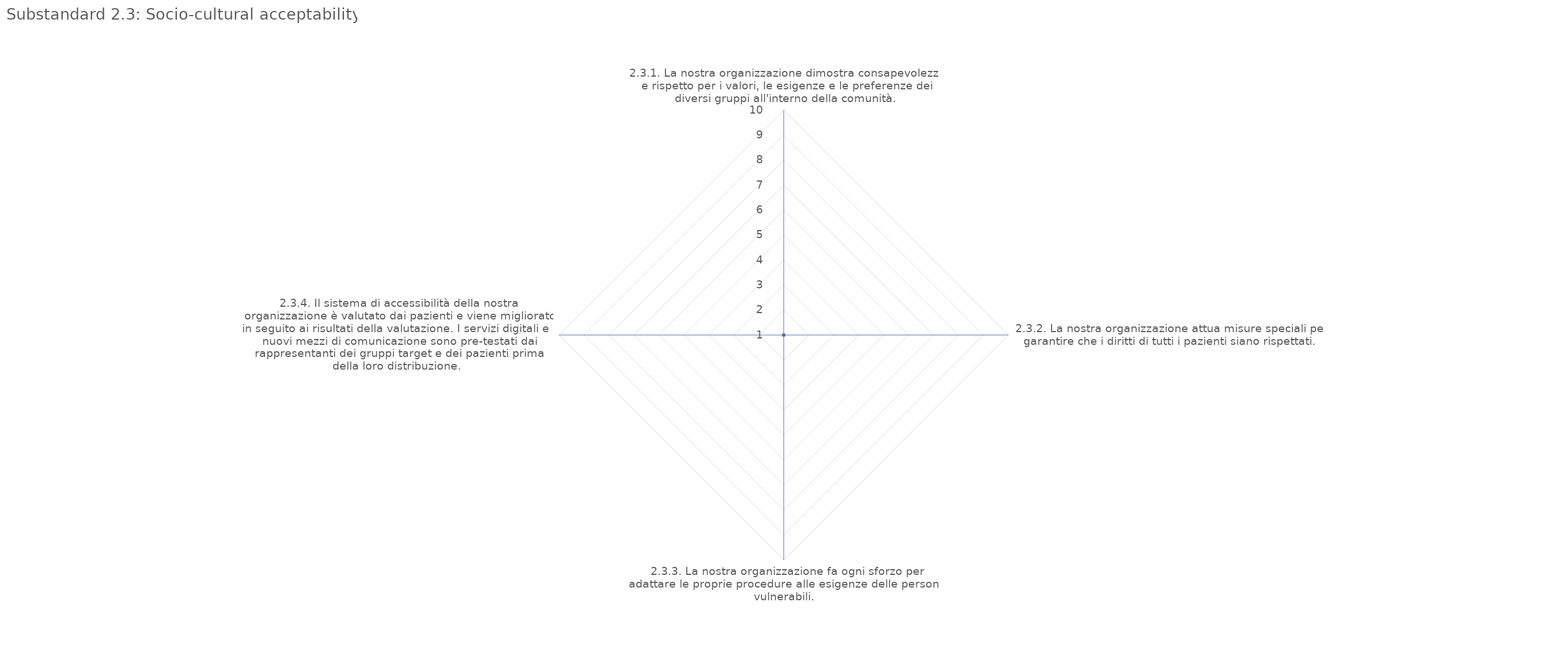
| Category | value |
|---|---|
| 2.3.1. La nostra organizzazione dimostra consapevolezza e rispetto per i valori, le esigenze e le preferenze dei diversi gruppi all'interno della comunità. | 1 |
| 2.3.2. La nostra organizzazione attua misure speciali per garantire che i diritti di tutti i pazienti siano rispettati. | 1 |
| 2.3.3. La nostra organizzazione fa ogni sforzo per adattare le proprie procedure alle esigenze delle persone vulnerabili. | 1 |
| 2.3.4. Il sistema di accessibilità della nostra organizzazione è valutato dai pazienti e viene migliorato in seguito ai risultati della valutazione. I servizi digitali e i nuovi mezzi di comunicazione sono pre-testati dai rappresentanti dei gruppi target  | 1 |